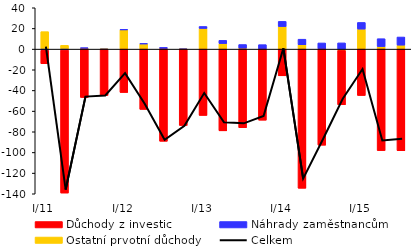
| Category | Ostatní prvotní důchody | Náhrady zaměstnancům | Důchody z investic |
|---|---|---|---|
| I/11 | 16.905 | -1.179 | -13.01 |
| II | 3.673 | -0.898 | -138.45 |
| III | 0.917 | 0.182 | -46.828 |
| IV | 0.201 | -0.359 | -44.5 |
| I/12 | 18.684 | 0.227 | -41.994 |
| II | 5.046 | 0.336 | -58.363 |
| III | 0.625 | 1.034 | -89.224 |
| IV | 0.042 | -0.116 | -73.825 |
| I/13 | 19.989 | 1.936 | -64.207 |
| II | 5.367 | 3.108 | -79.099 |
| III | 0.9 | 3.539 | -76.077 |
| IV | -0.021 | 4.321 | -68.775 |
| I/14 | 21.825 | 5.021 | -25.838 |
| II | 4.194 | 5.405 | -134.69 |
| III | 0.166 | 5.79 | -92.96 |
| IV | -1.284 | 6.025 | -52.617 |
| I/15 | 19.364 | 6.452 | -44.908 |
| II | 2.466 | 7.619 | -98.264 |
| III | 3.856 | 7.858 | -98.284 |